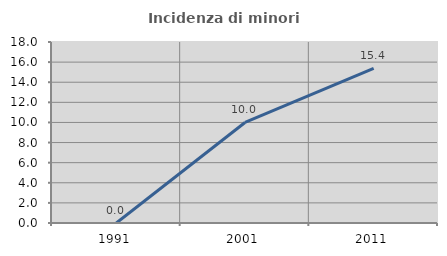
| Category | Incidenza di minori stranieri |
|---|---|
| 1991.0 | 0 |
| 2001.0 | 10 |
| 2011.0 | 15.385 |